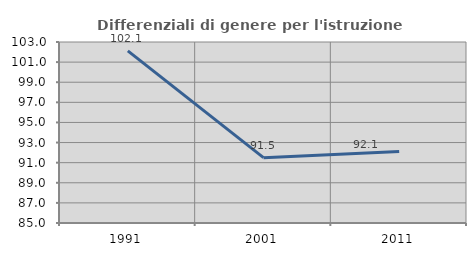
| Category | Differenziali di genere per l'istruzione superiore |
|---|---|
| 1991.0 | 102.12 |
| 2001.0 | 91.5 |
| 2011.0 | 92.117 |